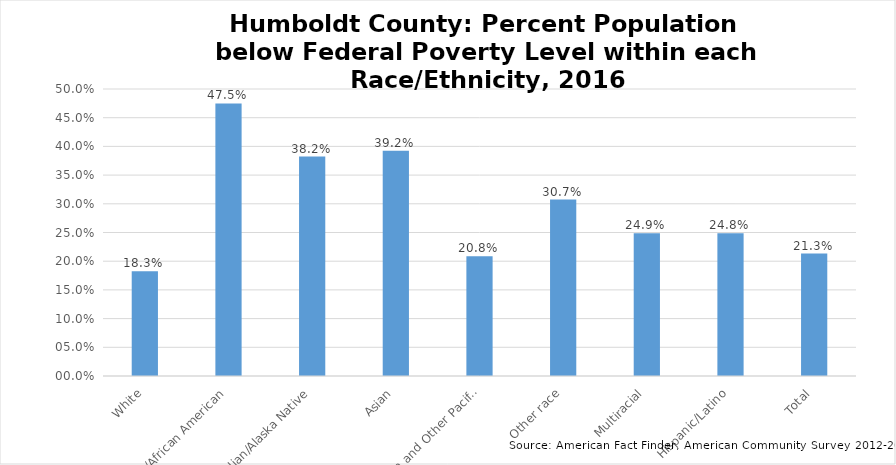
| Category | Percent Population below Poverty Level in Humboldt County |
|---|---|
| White | 0.183 |
| Black/African American | 0.475 |
| American Indian/Alaska Native | 0.382 |
| Asian | 0.392 |
|  Native Hawaiian and Other Pacific Islander | 0.208 |
| Other race | 0.307 |
| Multiracial | 0.249 |
| Hispanic/Latino | 0.248 |
| Total | 0.213 |